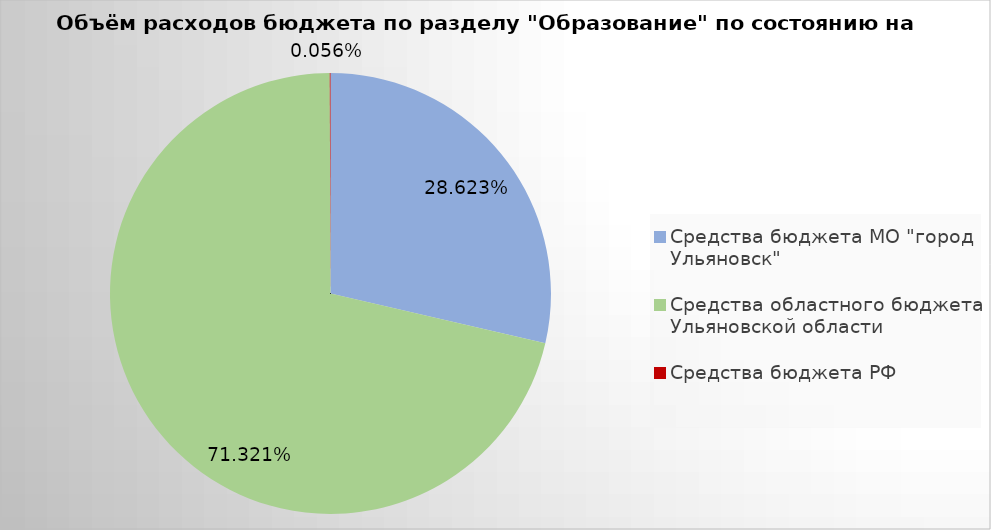
| Category | Series 0 |
|---|---|
| Средства бюджета МО "город Ульяновск" | 1695459.81 |
| Средства областного бюджета Ульяновской области | 4224628.67 |
| Средства бюджета РФ | 3283.27 |